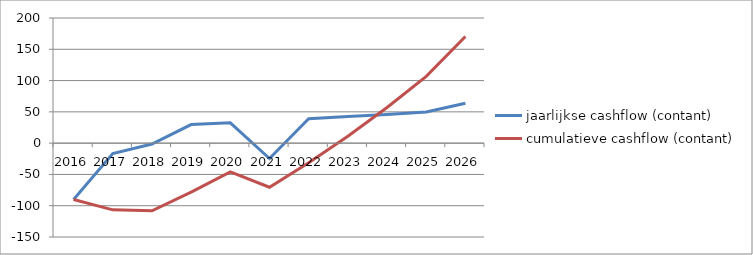
| Category | jaarlijkse cashflow (contant) | cumulatieve cashflow (contant) |
|---|---|---|
| 2016.0 | -90 | -90 |
| 2017.0 | -16.625 | -106.625 |
| 2018.0 | -1.401 | -108.026 |
| 2019.0 | 29.68 | -78.346 |
| 2020.0 | 32.449 | -45.897 |
| 2021.0 | -24.599 | -70.496 |
| 2022.0 | 39.045 | -31.451 |
| 2023.0 | 42.393 | 10.942 |
| 2024.0 | 45.956 | 56.898 |
| 2025.0 | 49.747 | 106.645 |
| 2026.0 | 63.779 | 170.425 |